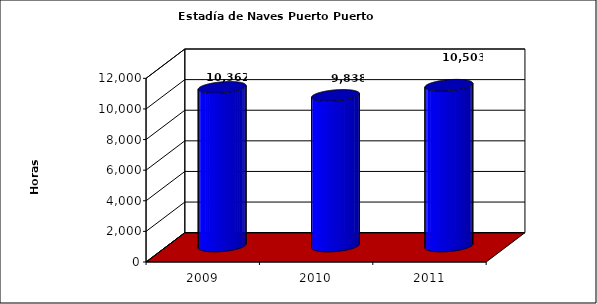
| Category | Series 0 |
|---|---|
| 2009.0 | 10362 |
| 2010.0 | 9838 |
| 2011.0 | 10503 |